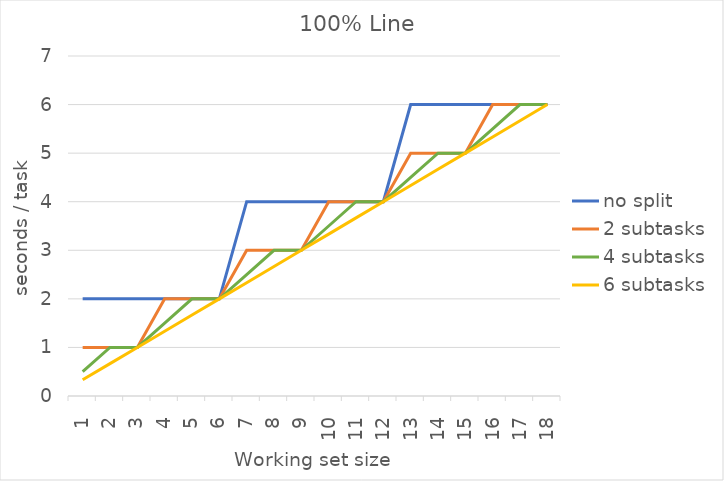
| Category | no split | 2 subtasks | 4 subtasks | 6 subtasks |
|---|---|---|---|---|
| 1.0 | 2 | 1 | 0.5 | 0.333 |
| 2.0 | 2 | 1 | 1 | 0.667 |
| 3.0 | 2 | 1 | 1 | 1 |
| 4.0 | 2 | 2 | 1.5 | 1.333 |
| 5.0 | 2 | 2 | 2 | 1.667 |
| 6.0 | 2 | 2 | 2 | 2 |
| 7.0 | 4 | 3 | 2.5 | 2.333 |
| 8.0 | 4 | 3 | 3 | 2.667 |
| 9.0 | 4 | 3 | 3 | 3 |
| 10.0 | 4 | 4 | 3.5 | 3.333 |
| 11.0 | 4 | 4 | 4 | 3.667 |
| 12.0 | 4 | 4 | 4 | 4 |
| 13.0 | 6 | 5 | 4.5 | 4.333 |
| 14.0 | 6 | 5 | 5 | 4.667 |
| 15.0 | 6 | 5 | 5 | 5 |
| 16.0 | 6 | 6 | 5.5 | 5.333 |
| 17.0 | 6 | 6 | 6 | 5.667 |
| 18.0 | 6 | 6 | 6 | 6 |